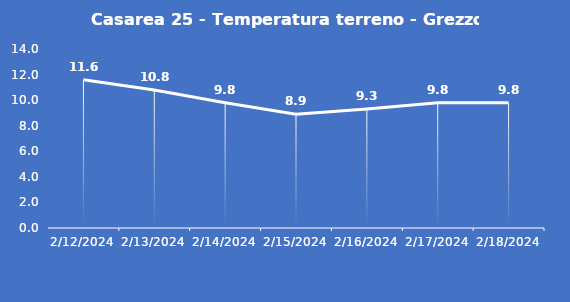
| Category | Casarea 25 - Temperatura terreno - Grezzo (°C) |
|---|---|
| 2/12/24 | 11.6 |
| 2/13/24 | 10.8 |
| 2/14/24 | 9.8 |
| 2/15/24 | 8.9 |
| 2/16/24 | 9.3 |
| 2/17/24 | 9.8 |
| 2/18/24 | 9.8 |